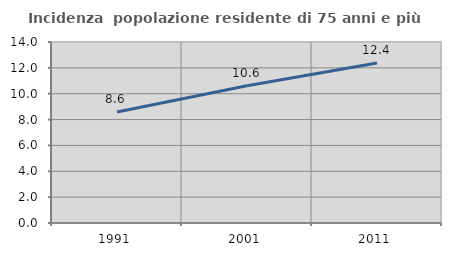
| Category | Incidenza  popolazione residente di 75 anni e più |
|---|---|
| 1991.0 | 8.586 |
| 2001.0 | 10.619 |
| 2011.0 | 12.377 |